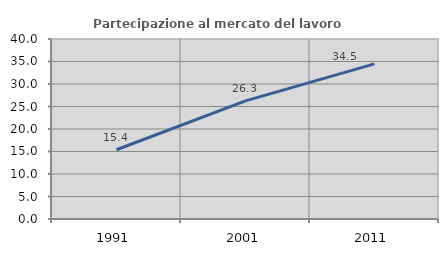
| Category | Partecipazione al mercato del lavoro  femminile |
|---|---|
| 1991.0 | 15.385 |
| 2001.0 | 26.263 |
| 2011.0 | 34.483 |